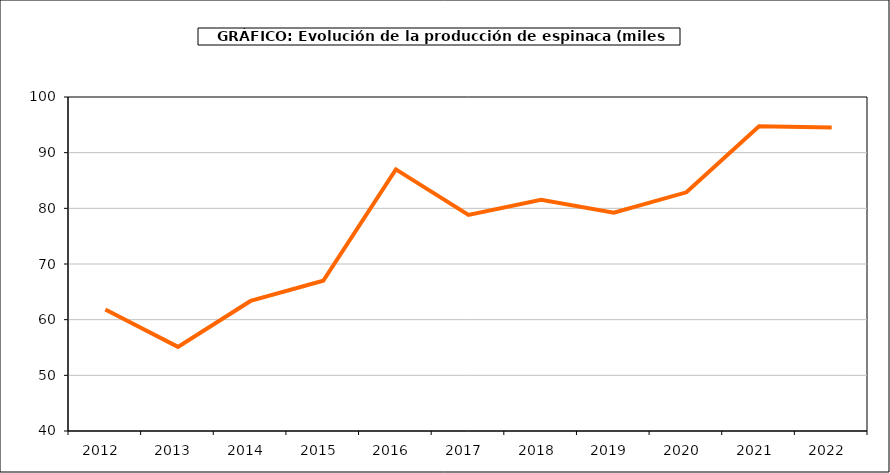
| Category | producción |
|---|---|
| 2012.0 | 61.814 |
| 2013.0 | 55.11 |
| 2014.0 | 63.364 |
| 2015.0 | 66.989 |
| 2016.0 | 86.99 |
| 2017.0 | 78.802 |
| 2018.0 | 81.53 |
| 2019.0 | 79.216 |
| 2020.0 | 82.88 |
| 2021.0 | 94.754 |
| 2022.0 | 94.51 |